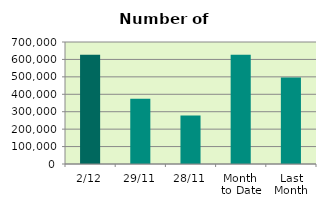
| Category | Series 0 |
|---|---|
| 2/12 | 627032 |
| 29/11 | 373856 |
| 28/11 | 278416 |
| Month 
to Date | 627032 |
| Last
Month | 495852.095 |